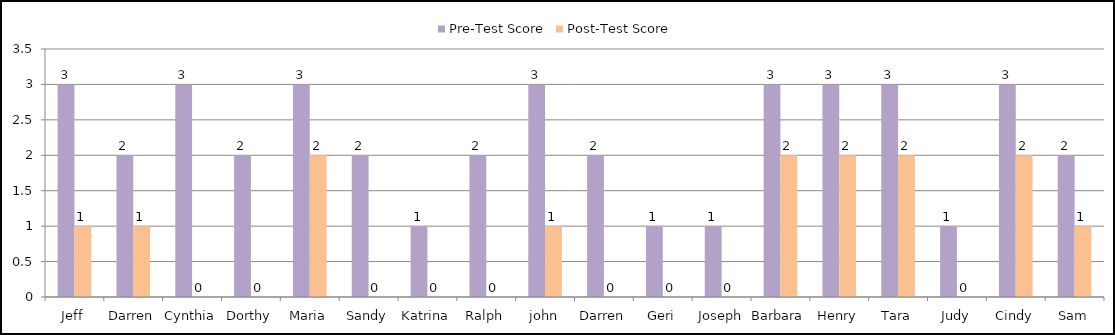
| Category | Pre-Test Score | Post-Test Score |
|---|---|---|
| Jeff | 3 | 1 |
| Darren | 2 | 1 |
| Cynthia | 3 | 0 |
| Dorthy | 2 | 0 |
| Maria | 3 | 2 |
| Sandy | 2 | 0 |
| Katrina | 1 | 0 |
| Ralph | 2 | 0 |
| john | 3 | 1 |
| Darren | 2 | 0 |
| Geri | 1 | 0 |
| Joseph | 1 | 0 |
| Barbara | 3 | 2 |
| Henry | 3 | 2 |
| Tara | 3 | 2 |
| Judy | 1 | 0 |
| Cindy | 3 | 2 |
| Sam | 2 | 1 |